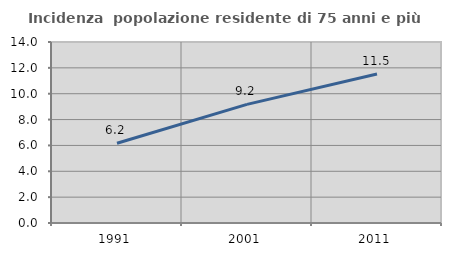
| Category | Incidenza  popolazione residente di 75 anni e più |
|---|---|
| 1991.0 | 6.169 |
| 2001.0 | 9.175 |
| 2011.0 | 11.523 |